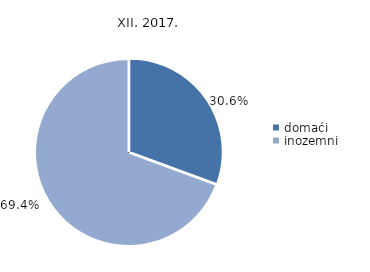
| Category | 2017. |
|---|---|
| domaći | 30.6 |
| inozemni | 69.4 |